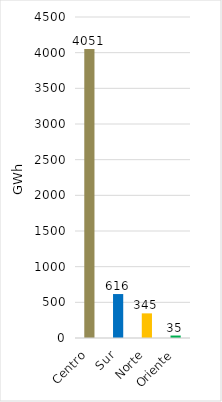
| Category | Series 0 |
|---|---|
| Centro | 4051.05 |
| Sur | 616.148 |
| Norte | 345.346 |
| Oriente | 34.561 |